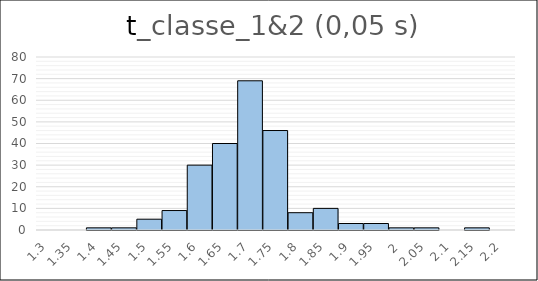
| Category | Series 0 |
|---|---|
| 1.3 | 0 |
| 1.35 | 0 |
| 1.4 | 1 |
| 1.45 | 1 |
| 1.5 | 5 |
| 1.55 | 9 |
| 1.6 | 30 |
| 1.65 | 40 |
| 1.7 | 69 |
| 1.75 | 46 |
| 1.8 | 8 |
| 1.85 | 10 |
| 1.9 | 3 |
| 1.95 | 3 |
| 2.0 | 1 |
| 2.05 | 1 |
| 2.1 | 0 |
| 2.15 | 1 |
| 2.2 | 0 |